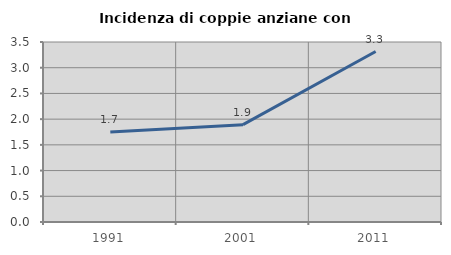
| Category | Incidenza di coppie anziane con figli |
|---|---|
| 1991.0 | 1.748 |
| 2001.0 | 1.893 |
| 2011.0 | 3.315 |